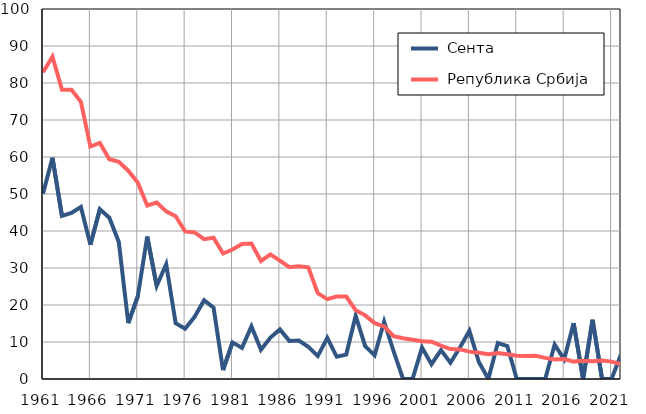
| Category |  Сента |  Република Србија |
|---|---|---|
| 1961.0 | 50.1 | 82.9 |
| 1962.0 | 59.8 | 87.1 |
| 1963.0 | 44.1 | 78.2 |
| 1964.0 | 44.9 | 78.2 |
| 1965.0 | 46.5 | 74.9 |
| 1966.0 | 36.3 | 62.8 |
| 1967.0 | 45.9 | 63.8 |
| 1968.0 | 43.6 | 59.4 |
| 1969.0 | 37 | 58.7 |
| 1970.0 | 15.1 | 56.3 |
| 1971.0 | 22.3 | 53.1 |
| 1972.0 | 38.5 | 46.9 |
| 1973.0 | 25.2 | 47.7 |
| 1974.0 | 31 | 45.3 |
| 1975.0 | 15.1 | 44 |
| 1976.0 | 13.6 | 39.9 |
| 1977.0 | 16.8 | 39.6 |
| 1978.0 | 21.3 | 37.8 |
| 1979.0 | 19.3 | 38.2 |
| 1980.0 | 2.4 | 33.9 |
| 1981.0 | 9.9 | 35 |
| 1982.0 | 8.4 | 36.5 |
| 1983.0 | 14.2 | 36.6 |
| 1984.0 | 7.9 | 31.9 |
| 1985.0 | 11.2 | 33.7 |
| 1986.0 | 13.4 | 32 |
| 1987.0 | 10.3 | 30.2 |
| 1988.0 | 10.4 | 30.5 |
| 1989.0 | 8.7 | 30.2 |
| 1990.0 | 6.2 | 23.2 |
| 1991.0 | 11.1 | 21.6 |
| 1992.0 | 6 | 22.3 |
| 1993.0 | 6.6 | 22.3 |
| 1994.0 | 17.1 | 18.6 |
| 1995.0 | 8.9 | 17.2 |
| 1996.0 | 6.4 | 15.1 |
| 1997.0 | 15.5 | 14.2 |
| 1998.0 | 7.5 | 11.6 |
| 1999.0 | 0 | 11 |
| 2000.0 | 0 | 10.6 |
| 2001.0 | 8.5 | 10.2 |
| 2002.0 | 4 | 10.1 |
| 2003.0 | 7.8 | 9 |
| 2004.0 | 4.4 | 8.1 |
| 2005.0 | 8.5 | 8 |
| 2006.0 | 13 | 7.4 |
| 2007.0 | 4.6 | 7.1 |
| 2008.0 | 0 | 6.7 |
| 2009.0 | 9.7 | 7 |
| 2010.0 | 8.9 | 6.7 |
| 2011.0 | 0 | 6.3 |
| 2012.0 | 0 | 6.2 |
| 2013.0 | 0 | 6.3 |
| 2014.0 | 0 | 5.7 |
| 2015.0 | 9.3 | 5.3 |
| 2016.0 | 5.3 | 5.4 |
| 2017.0 | 15.1 | 4.7 |
| 2018.0 | 0 | 4.9 |
| 2019.0 | 16 | 4.8 |
| 2020.0 | 0 | 5 |
| 2021.0 | 0 | 4.7 |
| 2022.0 | 6.6 | 4 |